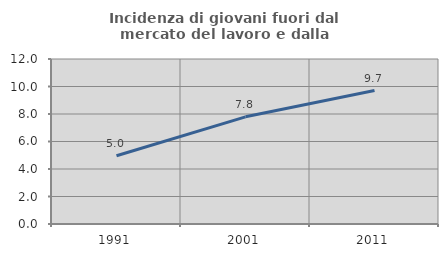
| Category | Incidenza di giovani fuori dal mercato del lavoro e dalla formazione  |
|---|---|
| 1991.0 | 4.962 |
| 2001.0 | 7.795 |
| 2011.0 | 9.705 |